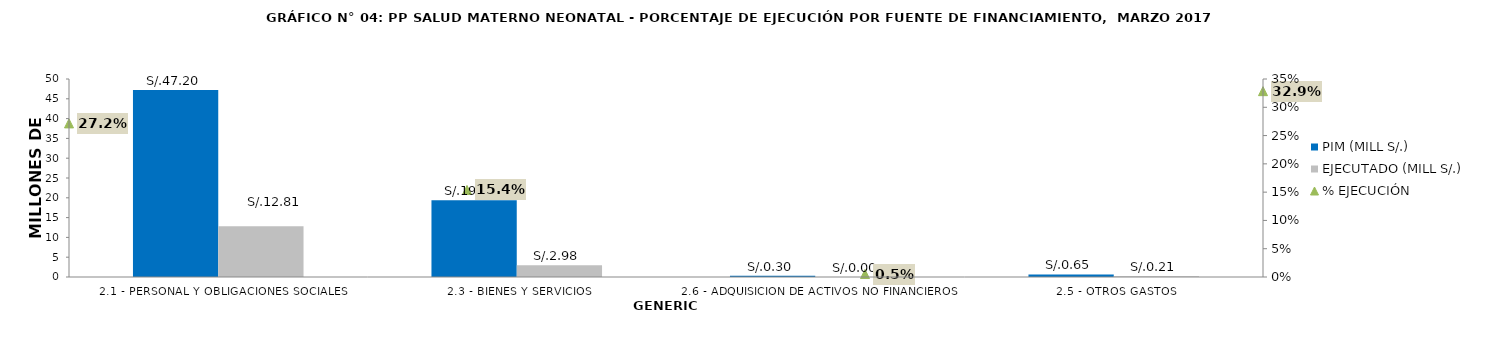
| Category | PIM (MILL S/.) | EJECUTADO (MILL S/.) |
|---|---|---|
| 2.1 - PERSONAL Y OBLIGACIONES SOCIALES | 47.198 | 12.815 |
| 2.3 - BIENES Y SERVICIOS | 19.357 | 2.979 |
| 2.6 - ADQUISICION DE ACTIVOS NO FINANCIEROS | 0.305 | 0.002 |
| 2.5 - OTROS GASTOS | 0.647 | 0.213 |